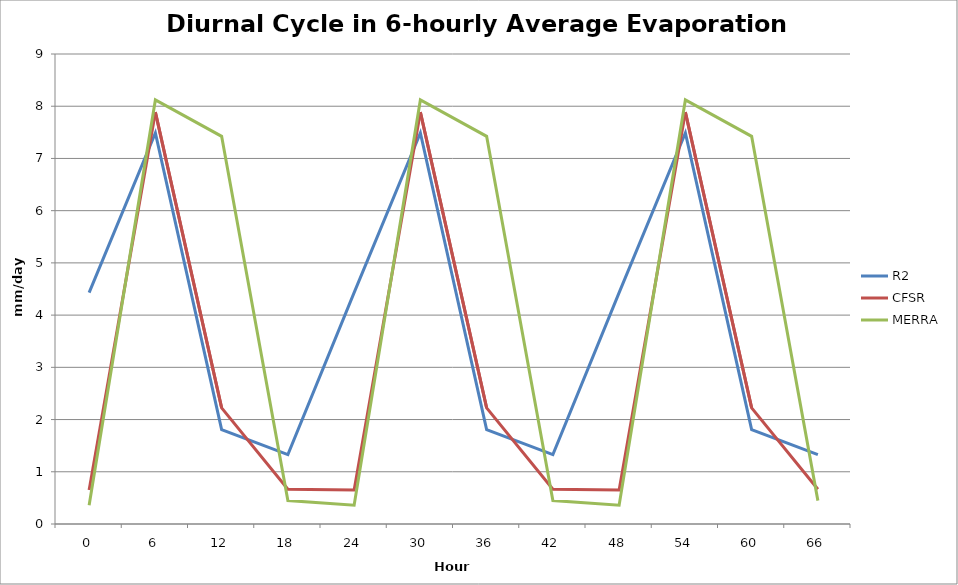
| Category | R2 | CFSR | MERRA |
|---|---|---|---|
| 0.0 | 4.432 | 0.653 | 0.359 |
| 6.0 | 7.489 | 7.886 | 8.121 |
| 12.0 | 1.809 | 2.223 | 7.423 |
| 18.0 | 1.329 | 0.665 | 0.448 |
| 24.0 | 4.432 | 0.653 | 0.359 |
| 30.0 | 7.489 | 7.886 | 8.121 |
| 36.0 | 1.809 | 2.223 | 7.423 |
| 42.0 | 1.329 | 0.665 | 0.448 |
| 48.0 | 4.432 | 0.653 | 0.359 |
| 54.0 | 7.489 | 7.886 | 8.121 |
| 60.0 | 1.809 | 2.223 | 7.423 |
| 66.0 | 1.329 | 0.665 | 0.448 |